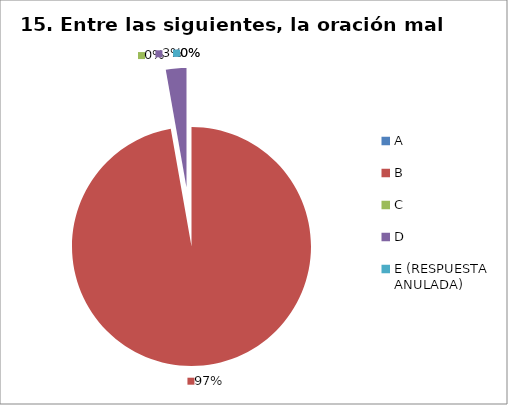
| Category | CANTIDAD DE RESPUESTAS PREGUNTA (15) | PORCENTAJE |
|---|---|---|
| A | 0 | 0 |
| B | 35 | 0.972 |
| C | 0 | 0 |
| D | 1 | 0.028 |
| E (RESPUESTA ANULADA) | 0 | 0 |